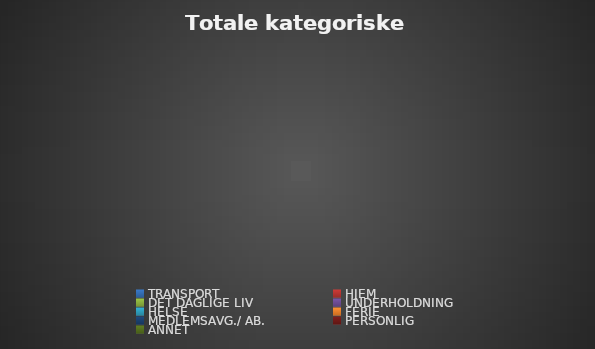
| Category | Series 0 |
|---|---|
| TRANSPORT | 0 |
| HJEM | 0 |
| DET DAGLIGE LIV | 0 |
| UNDERHOLDNING | 0 |
| HELSE | 0 |
| FERIE | 0 |
| MEDLEMSAVG./ AB. | 0 |
| PERSONLIG | 0 |
| ANNET | 0 |